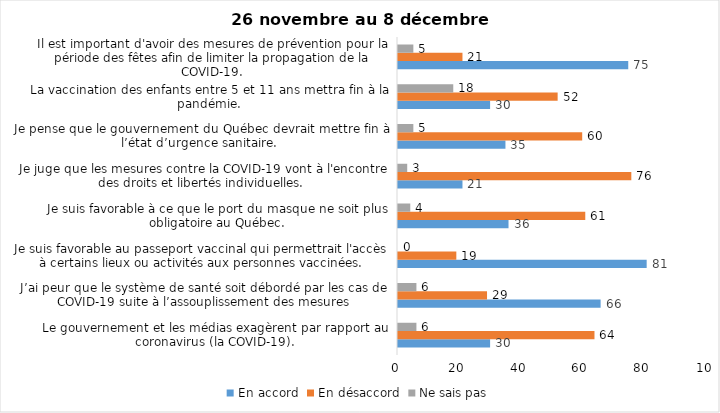
| Category | En accord | En désaccord | Ne sais pas |
|---|---|---|---|
| Le gouvernement et les médias exagèrent par rapport au coronavirus (la COVID-19). | 30 | 64 | 6 |
| J’ai peur que le système de santé soit débordé par les cas de COVID-19 suite à l’assouplissement des mesures | 66 | 29 | 6 |
| Je suis favorable au passeport vaccinal qui permettrait l'accès à certains lieux ou activités aux personnes vaccinées. | 81 | 19 | 0 |
| Je suis favorable à ce que le port du masque ne soit plus obligatoire au Québec. | 36 | 61 | 4 |
| Je juge que les mesures contre la COVID-19 vont à l'encontre des droits et libertés individuelles.  | 21 | 76 | 3 |
| Je pense que le gouvernement du Québec devrait mettre fin à l’état d’urgence sanitaire.  | 35 | 60 | 5 |
| La vaccination des enfants entre 5 et 11 ans mettra fin à la pandémie. | 30 | 52 | 18 |
| Il est important d'avoir des mesures de prévention pour la période des fêtes afin de limiter la propagation de la COVID-19. | 75 | 21 | 5 |